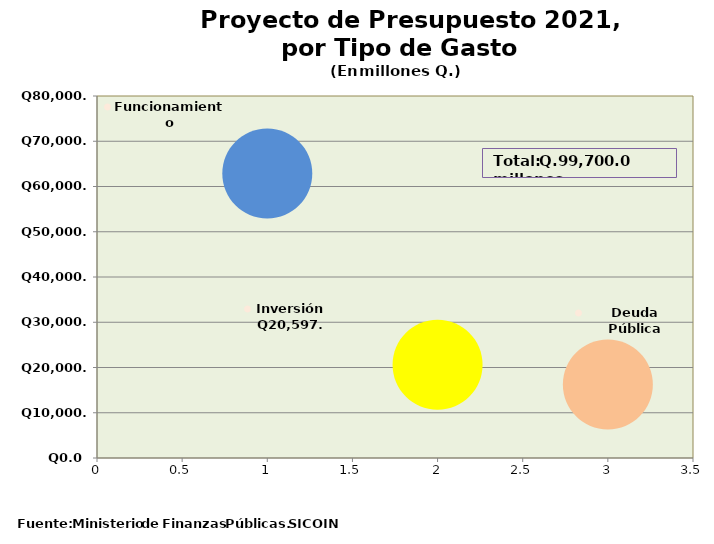
| Category | Recomendado 2017 |
|---|---|
| 0 | 62875.6 |
| 1 | 20597.1 |
| 2 | 16227.3 |